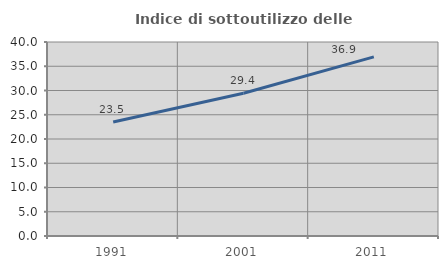
| Category | Indice di sottoutilizzo delle abitazioni  |
|---|---|
| 1991.0 | 23.506 |
| 2001.0 | 29.436 |
| 2011.0 | 36.94 |